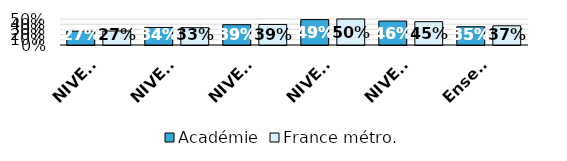
| Category | Académie | France métro. |
|---|---|---|
| NIVEAU 3 | 0.266 | 0.269 |
| NIVEAU 4 | 0.338 | 0.333 |
| NIVEAU 5 | 0.39 | 0.395 |
| NIVEAU 6 | 0.489 | 0.503 |
| NIVEAU 7 | 0.461 | 0.449 |
| Ensemble | 0.351 | 0.369 |